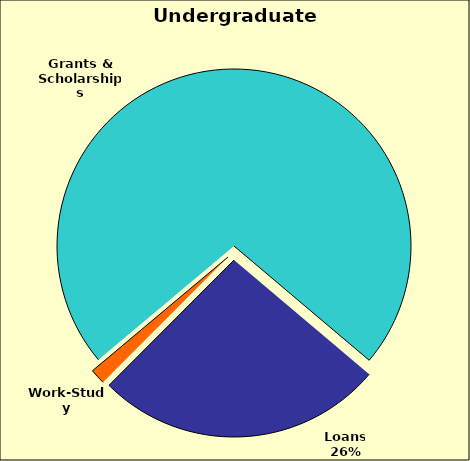
| Category | Series 0 |
|---|---|
| Grants & Scholarships | 0.723 |
| Loans | 0.263 |
| Work-Study | 0.014 |